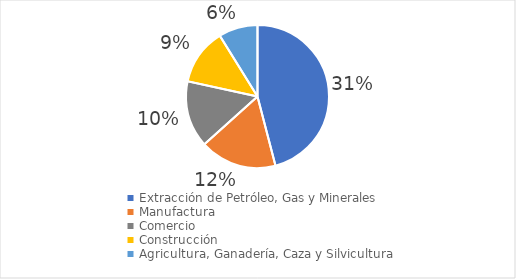
| Category | Series 0 |
|---|---|
| Extracción de Petróleo, Gas y Minerales | 0.309 |
| Manufactura | 0.117 |
| Comercio | 0.101 |
| Construcción | 0.086 |
| Agricultura, Ganadería, Caza y Silvicultura | 0.059 |